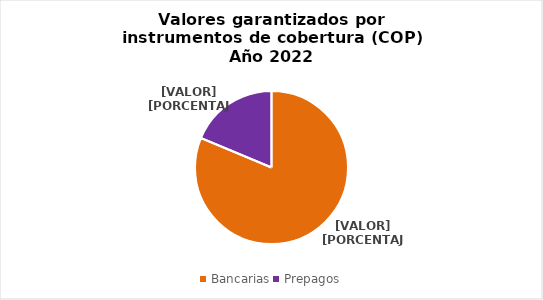
| Category | Series 0 |
|---|---|
| Bancarias | 8195947933356 |
| Prepagos | 1886252048220 |